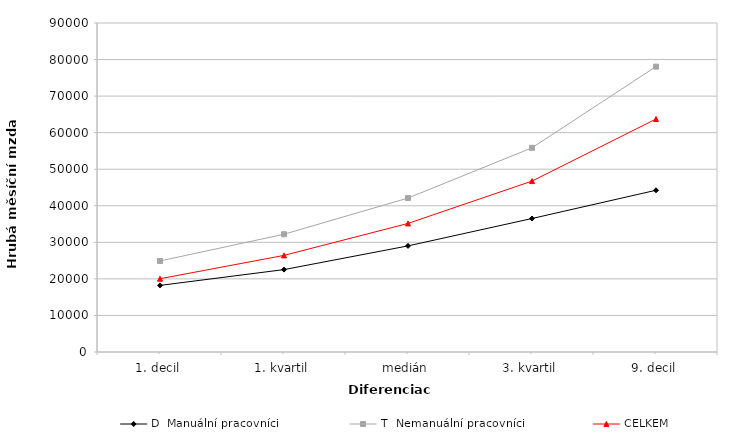
| Category | D  Manuální pracovníci | T  Nemanuální pracovníci | CELKEM |
|---|---|---|---|
| 1. decil | 18218.979 | 24904.295 | 20045.171 |
| 1. kvartil | 22538.946 | 32217.904 | 26426.076 |
| medián | 29026.708 | 42109.999 | 35169.444 |
| 3. kvartil | 36516.607 | 55858.646 | 46754.92 |
| 9. decil | 44245.103 | 78062.643 | 63730.156 |